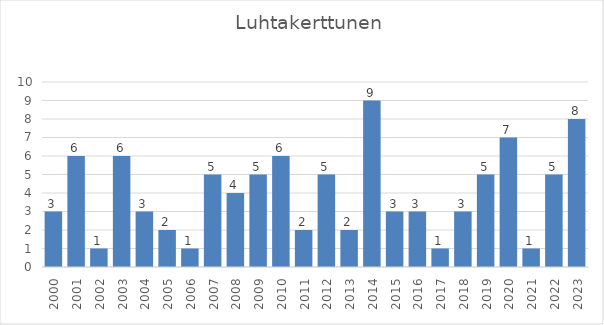
| Category | Series 0 |
|---|---|
| 2000.0 | 3 |
| 2001.0 | 6 |
| 2002.0 | 1 |
| 2003.0 | 6 |
| 2004.0 | 3 |
| 2005.0 | 2 |
| 2006.0 | 1 |
| 2007.0 | 5 |
| 2008.0 | 4 |
| 2009.0 | 5 |
| 2010.0 | 6 |
| 2011.0 | 2 |
| 2012.0 | 5 |
| 2013.0 | 2 |
| 2014.0 | 9 |
| 2015.0 | 3 |
| 2016.0 | 3 |
| 2017.0 | 1 |
| 2018.0 | 3 |
| 2019.0 | 5 |
| 2020.0 | 7 |
| 2021.0 | 1 |
| 2022.0 | 5 |
| 2023.0 | 8 |